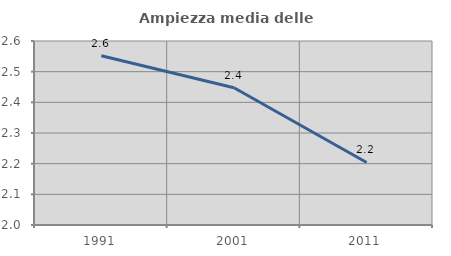
| Category | Ampiezza media delle famiglie |
|---|---|
| 1991.0 | 2.552 |
| 2001.0 | 2.448 |
| 2011.0 | 2.204 |